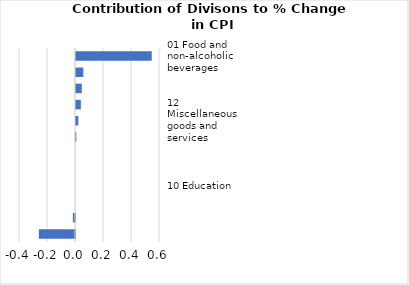
| Category |     Contributions |
|---|---|
| 01 Food and non-alcoholic beverages | 0.541 |
| 02 Alcoholic beverages, tobacco and narcotics | 0.052 |
| 03 Clothing and footwear | 0.041 |
| 05 Furnishings, household equipment and maintenance | 0.034 |
| 12 Miscellaneous goods and services | 0.017 |
| 04 Housing, water, electricity, gas and other fuels | 0.002 |
| 11 Restaurants and hotels | 0 |
| 09 Recreation and culture | 0 |
| 10 Education | 0 |
| 08 Communication | 0 |
| 06 Health | -0.015 |
| 07 Transport | -0.258 |